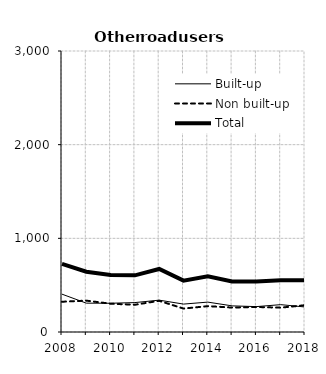
| Category | Built-up | Non built-up | Total |
|---|---|---|---|
| 2008.0 | 404 | 323 | 727 |
| 2009.0 | 308 | 335 | 643 |
| 2010.0 | 307 | 302 | 609 |
| 2011.0 | 314 | 291 | 605 |
| 2012.0 | 340 | 333 | 673 |
| 2013.0 | 298 | 250 | 548 |
| 2014.0 | 319 | 276 | 595 |
| 2015.0 | 279 | 261 | 540 |
| 2016.0 | 271 | 267 | 538 |
| 2017.0 | 292 | 260 | 552 |
| 2018.0 | 267 | 286 | 553 |